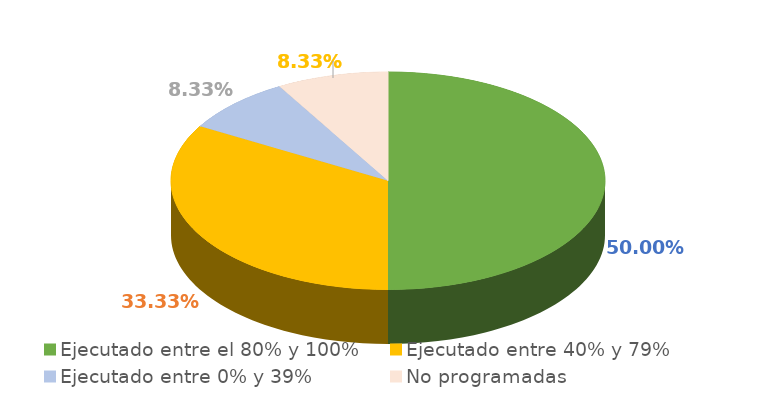
| Category | Series 0 |
|---|---|
| Ejecutado entre el 80% y 100% | 0.5 |
| Ejecutado entre 40% y 79% | 0.333 |
| Ejecutado entre 0% y 39% | 0.083 |
| No programadas | 0.083 |